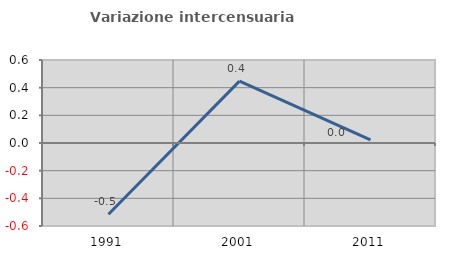
| Category | Variazione intercensuaria annua |
|---|---|
| 1991.0 | -0.515 |
| 2001.0 | 0.447 |
| 2011.0 | 0.022 |